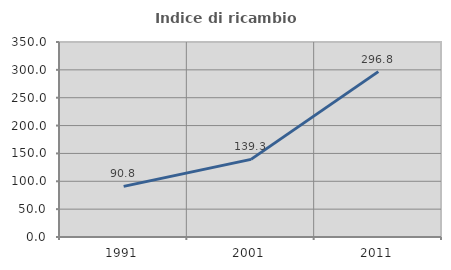
| Category | Indice di ricambio occupazionale  |
|---|---|
| 1991.0 | 90.839 |
| 2001.0 | 139.309 |
| 2011.0 | 296.806 |